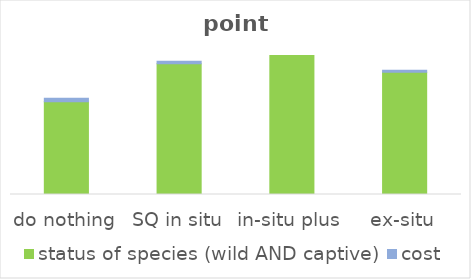
| Category | status of species (wild AND captive) | cost |
|---|---|---|
| do nothing | 0.498 | 0.02 |
| SQ in situ | 0.703 | 0.013 |
| in-situ plus | 0.746 | 0 |
| ex-situ | 0.656 | 0.011 |